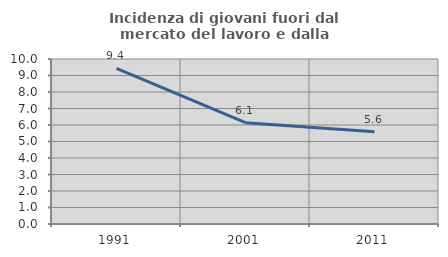
| Category | Incidenza di giovani fuori dal mercato del lavoro e dalla formazione  |
|---|---|
| 1991.0 | 9.429 |
| 2001.0 | 6.137 |
| 2011.0 | 5.59 |